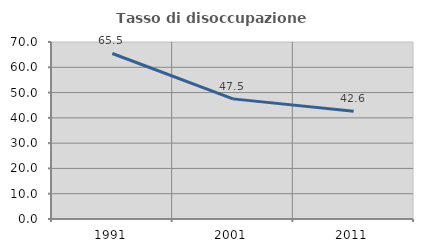
| Category | Tasso di disoccupazione giovanile  |
|---|---|
| 1991.0 | 65.452 |
| 2001.0 | 47.505 |
| 2011.0 | 42.588 |